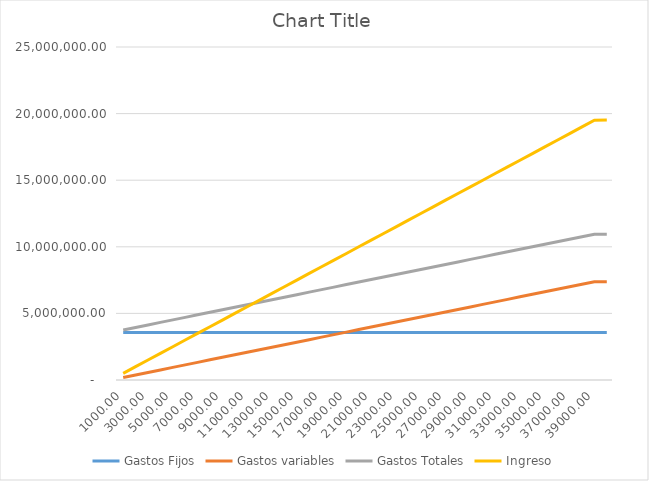
| Category | Gastos Fijos | Gastos variables | Gastos Totales | Ingreso |
|---|---|---|---|---|
| 1000.0 | 3567656.07 | 189223.488 | 3756879.559 | 500000 |
| 2000.0 | 3567656.07 | 378446.976 | 3946103.047 | 1000000 |
| 3000.0 | 3567656.07 | 567670.465 | 4135326.535 | 1500000 |
| 4000.0 | 3567656.07 | 756893.953 | 4324550.023 | 2000000 |
| 5000.0 | 3567656.07 | 946117.441 | 4513773.512 | 2500000 |
| 6000.0 | 3567656.07 | 1135340.929 | 4702997 | 3000000 |
| 7000.0 | 3567656.07 | 1324564.418 | 4892220.488 | 3500000 |
| 8000.0 | 3567656.07 | 1513787.906 | 5081443.976 | 4000000 |
| 9000.0 | 3567656.07 | 1703011.394 | 5270667.464 | 4500000 |
| 10000.0 | 3567656.07 | 1892234.882 | 5459890.953 | 5000000 |
| 11000.0 | 3567656.07 | 2081458.37 | 5649114.441 | 5500000 |
| 12000.0 | 3567656.07 | 2270681.859 | 5838337.929 | 6000000 |
| 13000.0 | 3567656.07 | 2459905.347 | 6027561.417 | 6500000 |
| 14000.0 | 3567656.07 | 2649128.835 | 6216784.906 | 7000000 |
| 15000.0 | 3567656.07 | 2838352.323 | 6406008.394 | 7500000 |
| 16000.0 | 3567656.07 | 3027575.812 | 6595231.882 | 8000000 |
| 17000.0 | 3567656.07 | 3216799.3 | 6784455.37 | 8500000 |
| 18000.0 | 3567656.07 | 3406022.788 | 6973678.858 | 9000000 |
| 19000.0 | 3567656.07 | 3595246.276 | 7162902.347 | 9500000 |
| 20000.0 | 3567656.07 | 3784469.764 | 7352125.835 | 10000000 |
| 21000.0 | 3567656.07 | 3973693.253 | 7541349.323 | 10500000 |
| 22000.0 | 3567656.07 | 4162916.741 | 7730572.811 | 11000000 |
| 23000.0 | 3567656.07 | 4352140.229 | 7919796.3 | 11500000 |
| 24000.0 | 3567656.07 | 4541363.717 | 8109019.788 | 12000000 |
| 25000.0 | 3567656.07 | 4730587.206 | 8298243.276 | 12500000 |
| 26000.0 | 3567656.07 | 4919810.694 | 8487466.764 | 13000000 |
| 27000.0 | 3567656.07 | 5109034.182 | 8676690.252 | 13500000 |
| 28000.0 | 3567656.07 | 5298257.67 | 8865913.741 | 14000000 |
| 29000.0 | 3567656.07 | 5487481.158 | 9055137.229 | 14500000 |
| 30000.0 | 3567656.07 | 5676704.647 | 9244360.717 | 15000000 |
| 31000.0 | 3567656.07 | 5865928.135 | 9433584.205 | 15500000 |
| 32000.0 | 3567656.07 | 6055151.623 | 9622807.694 | 16000000 |
| 33000.0 | 3567656.07 | 6244375.111 | 9812031.182 | 16500000 |
| 34000.0 | 3567656.07 | 6433598.599 | 10001254.67 | 17000000 |
| 35000.0 | 3567656.07 | 6622822.088 | 10190478.158 | 17500000 |
| 36000.0 | 3567656.07 | 6812045.576 | 10379701.646 | 18000000 |
| 37000.0 | 3567656.07 | 7001269.064 | 10568925.135 | 18500000 |
| 38000.0 | 3567656.07 | 7190492.552 | 10758148.623 | 19000000 |
| 39000.0 | 3567656.07 | 7379716.041 | 10947372.111 | 19500000 |
| 39021.0 | 3567656.07 | 7383689.734 | 10951345.804 | 19510500 |